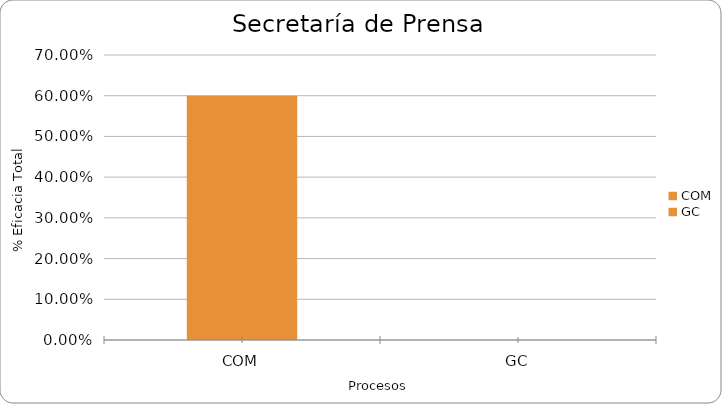
| Category | % Eficacia total |
|---|---|
| COM | 0.6 |
| GC | 0 |